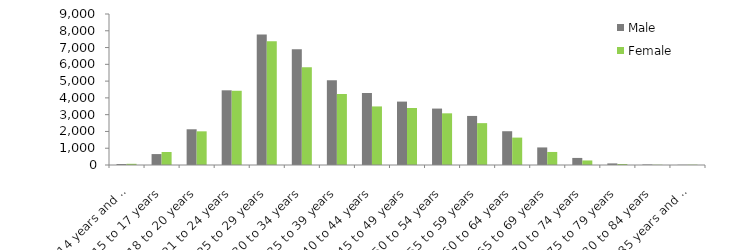
| Category | Male | Female |
|---|---|---|
| 14 years and under | 61 | 71 |
| 15 to 17 years | 651 | 774 |
| 18 to 20 years | 2129 | 2007 |
| 21 to 24 years | 4452 | 4424 |
| 25 to 29 years | 7785 | 7379 |
| 30 to 34 years | 6904 | 5825 |
| 35 to 39 years | 5051 | 4233 |
| 40 to 44 years | 4293 | 3491 |
| 45 to 49 years | 3779 | 3399 |
| 50 to 54 years | 3363 | 3080 |
| 55 to 59 years | 2924 | 2495 |
| 60 to 64 years | 2013 | 1633 |
| 65 to 69 years | 1047 | 777 |
| 70 to 74 years | 421 | 271 |
| 75 to 79 years | 95 | 59 |
| 80 to 84 years | 32 | 15 |
| 85 years and over | 13 | 19 |